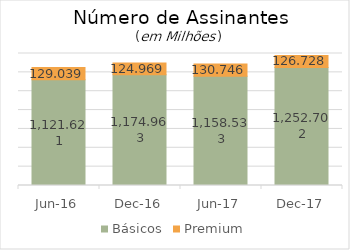
| Category | Básicos | Premium |
|---|---|---|
| 2016-06-01 | 1121620720.865 | 129038586 |
| 2016-12-01 | 1174963194.608 | 124968514 |
| 2017-06-01 | 1158533208.015 | 130746165.439 |
| 2017-12-01 | 1252701624.448 | 126728059.664 |